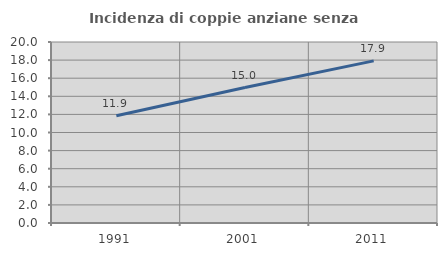
| Category | Incidenza di coppie anziane senza figli  |
|---|---|
| 1991.0 | 11.855 |
| 2001.0 | 14.971 |
| 2011.0 | 17.913 |